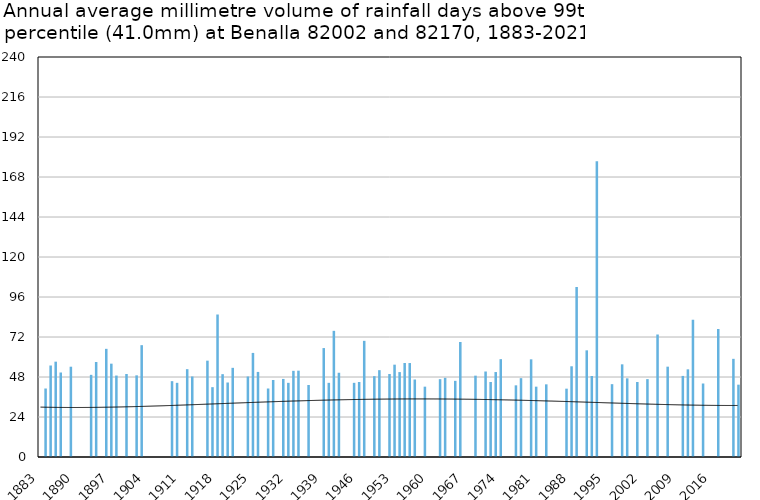
| Category | Annual average mm in days above 99th percentile |
|---|---|
| 1883 | 0 |
| 1884 | 41.1 |
| 1885 | 54.9 |
| 1886 | 57.2 |
| 1887 | 50.7 |
| 1888 | 0 |
| 1889 | 54.175 |
| 1890 | 0 |
| 1891 | 0 |
| 1892 | 0 |
| 1893 | 49.3 |
| 1894 | 57 |
| 1895 | 0 |
| 1896 | 64.9 |
| 1897 | 56 |
| 1898 | 48.867 |
| 1899 | 0 |
| 1900 | 49.8 |
| 1901 | 0 |
| 1902 | 49 |
| 1903 | 67.1 |
| 1904 | 0 |
| 1905 | 0 |
| 1906 | 0 |
| 1907 | 0 |
| 1908 | 0 |
| 1909 | 45.5 |
| 1910 | 44.5 |
| 1911 | 0 |
| 1912 | 52.7 |
| 1913 | 48.3 |
| 1914 | 0 |
| 1915 | 0 |
| 1916 | 57.8 |
| 1917 | 41.9 |
| 1918 | 85.5 |
| 1919 | 49.7 |
| 1920 | 44.7 |
| 1921 | 53.5 |
| 1922 | 0 |
| 1923 | 0 |
| 1924 | 48.3 |
| 1925 | 62.45 |
| 1926 | 51.05 |
| 1927 | 0 |
| 1928 | 41.1 |
| 1929 | 46.2 |
| 1930 | 0 |
| 1931 | 46.85 |
| 1932 | 44.5 |
| 1933 | 51.7 |
| 1934 | 51.8 |
| 1935 | 0 |
| 1936 | 43.2 |
| 1937 | 0 |
| 1938 | 0 |
| 1939 | 65.36 |
| 1940 | 44.5 |
| 1941 | 75.7 |
| 1942 | 50.55 |
| 1943 | 0 |
| 1944 | 0 |
| 1945 | 44.5 |
| 1946 | 45 |
| 1947 | 69.7 |
| 1948 | 0 |
| 1949 | 48.5 |
| 1950 | 52.1 |
| 1951 | 0 |
| 1952 | 49.8 |
| 1953 | 55.4 |
| 1954 | 50.95 |
| 1955 | 56.4 |
| 1956 | 56.375 |
| 1957 | 46.5 |
| 1958 | 0 |
| 1959 | 42.2 |
| 1960 | 0 |
| 1961 | 0 |
| 1962 | 46.7 |
| 1963 | 47.5 |
| 1964 | 0 |
| 1965 | 45.7 |
| 1966 | 69 |
| 1967 | 0 |
| 1968 | 0 |
| 1969 | 48.8 |
| 1970 | 0 |
| 1971 | 51.3 |
| 1972 | 45 |
| 1973 | 50.983 |
| 1974 | 58.7 |
| 1975 | 0 |
| 1976 | 0 |
| 1977 | 43 |
| 1978 | 47.3 |
| 1979 | 0 |
| 1980 | 58.6 |
| 1981 | 42.2 |
| 1982 | 0 |
| 1983 | 43.6 |
| 1984 | 0 |
| 1985 | 0 |
| 1986 | 0 |
| 1987 | 41 |
| 1988 | 54.433 |
| 1989 | 102 |
| 1990 | 0 |
| 1991 | 64 |
| 1992 | 48.6 |
| 1993 | 177.4 |
| 1994 | 0 |
| 1995 | 0 |
| 1996 | 43.7 |
| 1997 | 0 |
| 1998 | 55.6 |
| 1999 | 47.2 |
| 2000 | 0 |
| 2001 | 45 |
| 2002 | 0 |
| 2003 | 46.733 |
| 2004 | 0 |
| 2005 | 73.5 |
| 2006 | 0 |
| 2007 | 54.2 |
| 2008 | 0 |
| 2009 | 0 |
| 2010 | 48.65 |
| 2011 | 52.6 |
| 2012 | 82.35 |
| 2013 | 0 |
| 2014 | 44.1 |
| 2015 | 0 |
| 2016 | 0 |
| 2017 | 76.8 |
| 2018 | 0 |
| 2019 | 0 |
| 2020 | 58.9 |
| 2021 | 43.4 |